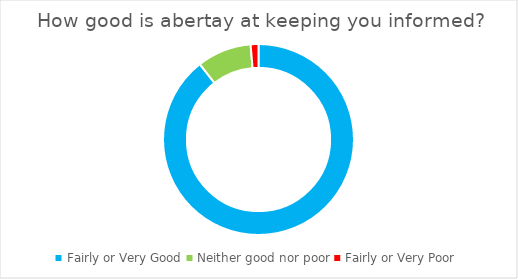
| Category | Series 0 |
|---|---|
| Fairly or Very Good | 89.47 |
| Neither good nor poor | 9.21 |
| Fairly or Very Poor | 1.32 |